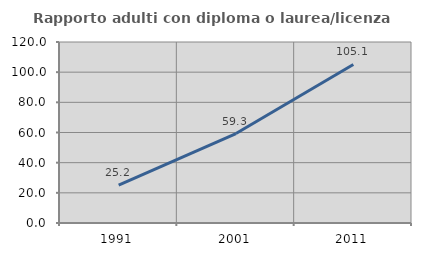
| Category | Rapporto adulti con diploma o laurea/licenza media  |
|---|---|
| 1991.0 | 25.171 |
| 2001.0 | 59.306 |
| 2011.0 | 105.11 |